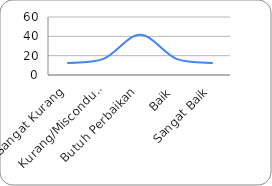
| Category | Pola Distribusi |
|---|---|
| Sangat Kurang | 12.5 |
| Kurang/Misconduct | 16.667 |
| Butuh Perbaikan | 41.667 |
| Baik | 16.667 |
| Sangat Baik | 12.5 |